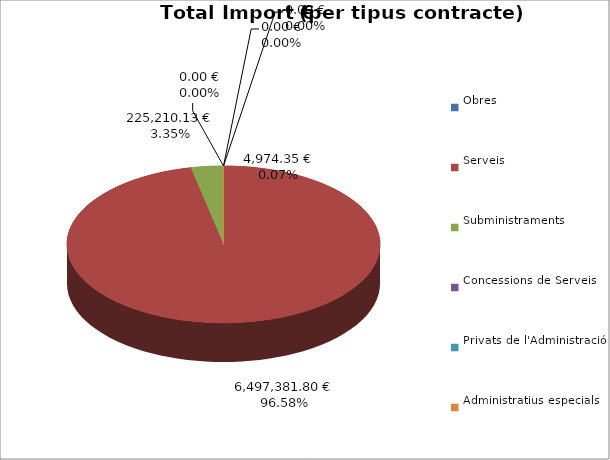
| Category | Total preu
(amb IVA) |
|---|---|
| Obres | 4974.35 |
| Serveis | 6497381.8 |
| Subministraments | 225210.13 |
| Concessions de Serveis | 0 |
| Privats de l'Administració | 0 |
| Administratius especials | 0 |